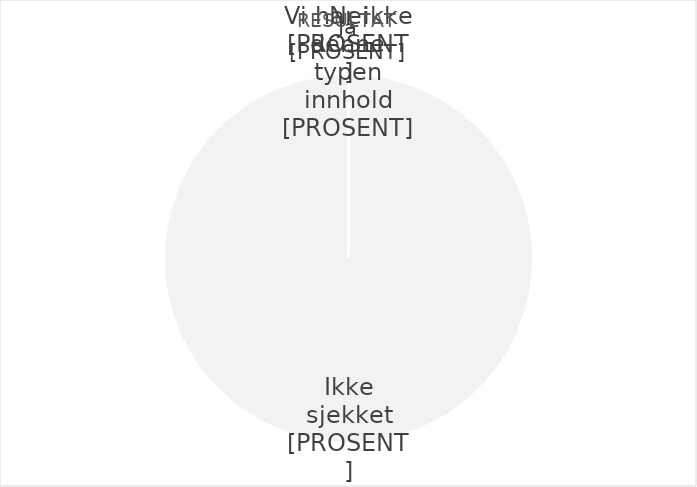
| Category | Series 0 |
|---|---|
| 0 | 0 |
| 1 | 0 |
| 2 | 0 |
| 3 | 48 |